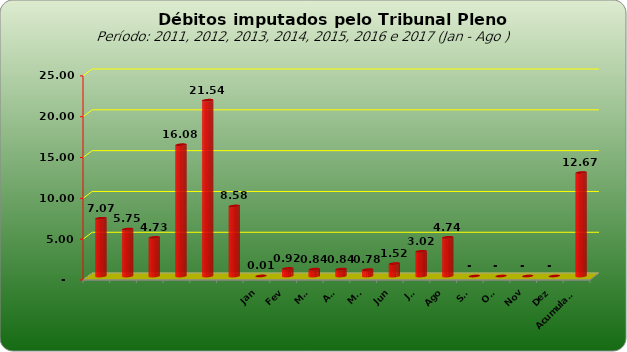
| Category |  7.073.154,74  |
|---|---|
|  | 7073154.74 |
|  | 5749129.25 |
|  | 4727033.51 |
|  | 16081820.48 |
|  | 21535723.6 |
|  | 8578266.09 |
| Jan | 7518 |
| Fev | 924330.96 |
| Mar | 840781.7 |
| Abr | 842058.28 |
| Mai | 780852.82 |
| Jun | 1521029.64 |
| Jul | 3021280.99 |
| Ago | 4735560.75 |
| Set | 0 |
| Out | 0 |
| Nov | 0 |
| Dez | 0 |
| Acumulado | 12673413.14 |